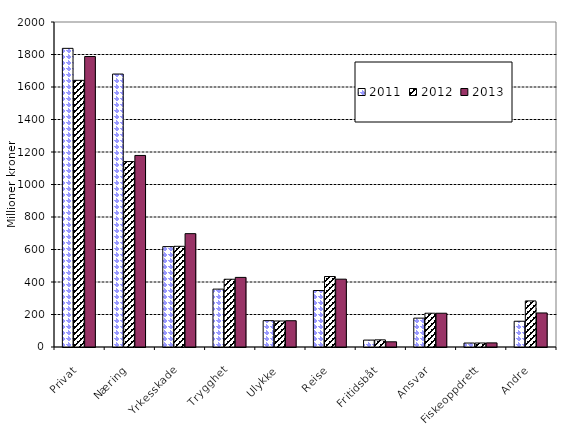
| Category | 2011 | 2012 | 2013 |
|---|---|---|---|
| Privat | 1837.796 | 1641.133 | 1787.549 |
| Næring | 1679.794 | 1141.205 | 1178.758 |
| Yrkesskade | 617.824 | 619.621 | 697.504 |
| Trygghet | 356.236 | 416.98 | 428.309 |
| Ulykke | 162.142 | 160.19 | 161.668 |
| Reise | 347.533 | 433.669 | 417.486 |
| Fritidsbåt | 42.529 | 43.997 | 31.948 |
| Ansvar | 177.627 | 207.818 | 207.845 |
| Fiskeoppdrett | 24.375 | 24.661 | 25.357 |
| Andre | 158.555 | 283.522 | 209.446 |